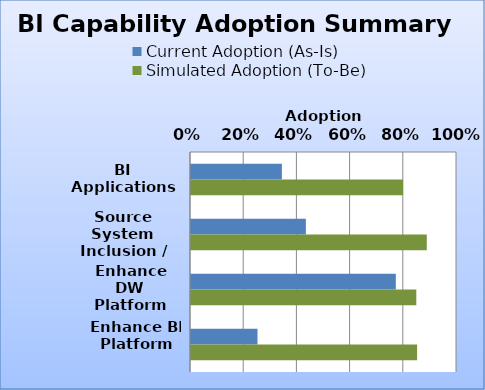
| Category | Current Adoption (As-Is) | Simulated Adoption (To-Be) |
|---|---|---|
| BI Applications | 0.342 | 0.797 |
| Source System Inclusion / Integration | 0.432 | 0.886 |
| Enhance DW Platform | 0.77 | 0.847 |
| Enhance BI Platform | 0.25 | 0.85 |